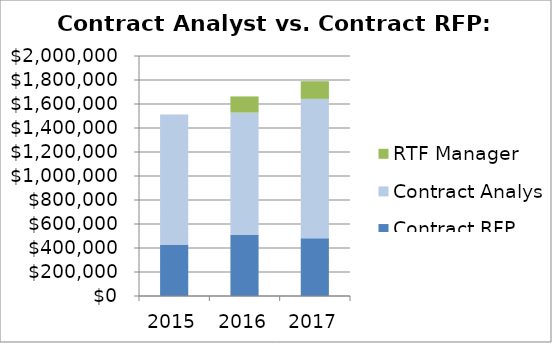
| Category | Contract RFP | Contract Analysts | RTF Manager |
|---|---|---|---|
| 2015.0 | 425600 | 1087000 | 0 |
| 2016.0 | 508000 | 1020000 | 135000 |
| 2017.0 | 480300 | 1162500 | 147000 |